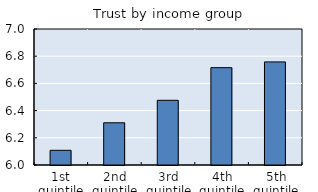
| Category | Self-reported trust in others |
|---|---|
| 1st quintile | 6.108 |
| 2nd quintile | 6.31 |
| 3rd quintile | 6.476 |
| 4th quintile | 6.716 |
| 5th quintile | 6.758 |